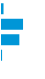
| Category | Series 0 |
|---|---|
| 0 | 0.038 |
| 1 | 0.526 |
| 2 | 0.434 |
| 3 | 0.002 |